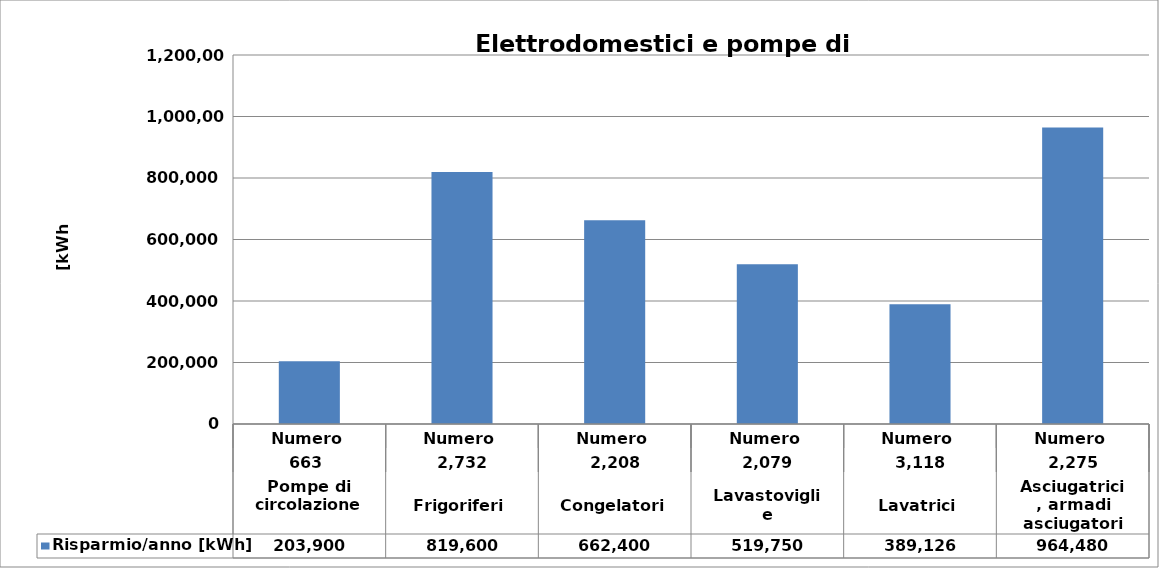
| Category | Risparmio/anno [kWh] |
|---|---|
| 0 | 203900 |
| 1 | 819600 |
| 2 | 662400 |
| 3 | 519750 |
| 4 | 389126.4 |
| 5 | 964480 |